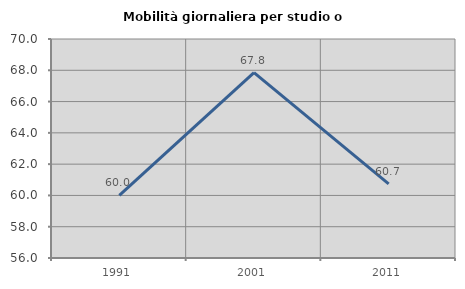
| Category | Mobilità giornaliera per studio o lavoro |
|---|---|
| 1991.0 | 60 |
| 2001.0 | 67.849 |
| 2011.0 | 60.744 |